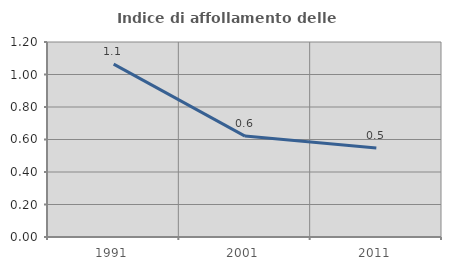
| Category | Indice di affollamento delle abitazioni  |
|---|---|
| 1991.0 | 1.064 |
| 2001.0 | 0.621 |
| 2011.0 | 0.548 |